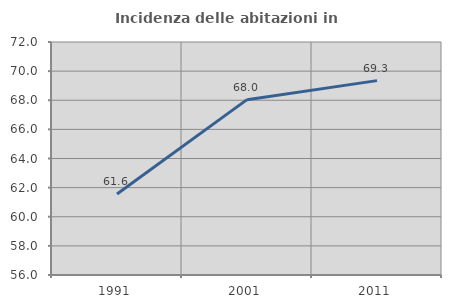
| Category | Incidenza delle abitazioni in proprietà  |
|---|---|
| 1991.0 | 61.564 |
| 2001.0 | 68.041 |
| 2011.0 | 69.348 |